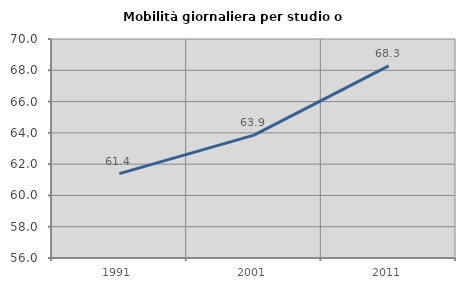
| Category | Mobilità giornaliera per studio o lavoro |
|---|---|
| 1991.0 | 61.393 |
| 2001.0 | 63.856 |
| 2011.0 | 68.287 |